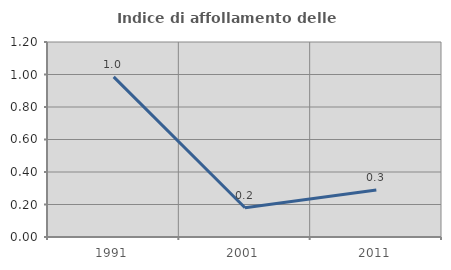
| Category | Indice di affollamento delle abitazioni  |
|---|---|
| 1991.0 | 0.985 |
| 2001.0 | 0.18 |
| 2011.0 | 0.289 |